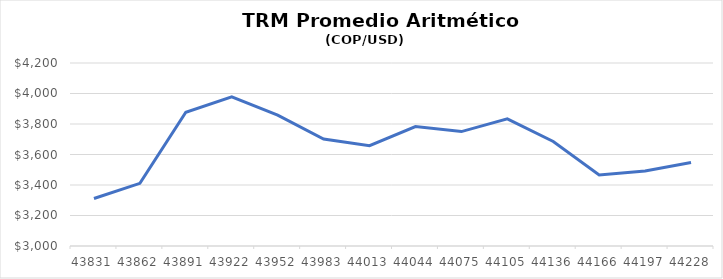
| Category | TRM Promedio Aritmético (COP/USD) |
|---|---|
| 43831.0 | 3311.19 |
| 43862.0 | 3411.05 |
| 43891.0 | 3877.05 |
| 43922.0 | 3977.39 |
| 43952.0 | 3858.19 |
| 43983.0 | 3701.6 |
| 44013.0 | 3657.87 |
| 44044.0 | 3783.03 |
| 44075.0 | 3750.22 |
| 44105.0 | 3833.79 |
| 44136.0 | 3685.63 |
| 44166.0 | 3466.13 |
| 44197.0 | 3491.32 |
| 44228.0 | 3547.4 |